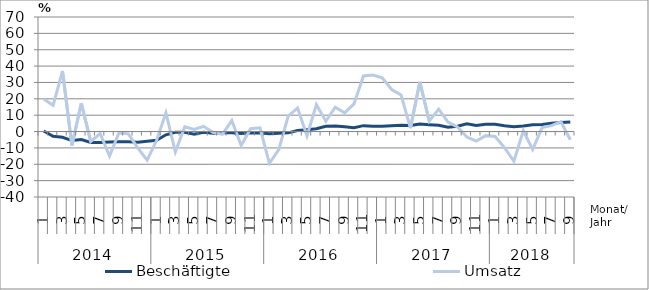
| Category | Beschäftigte | Umsatz |
|---|---|---|
| 0 | 0.3 | 19.9 |
| 1 | -2.9 | 16 |
| 2 | -3.5 | 37 |
| 3 | -5.5 | -8.5 |
| 4 | -4.9 | 17.3 |
| 5 | -6.7 | -6.1 |
| 6 | -6.7 | -1.2 |
| 7 | -6.4 | -15 |
| 8 | -6.2 | -0.8 |
| 9 | -6.2 | -1.4 |
| 10 | -6.6 | -10 |
| 11 | -5.9 | -17.5 |
| 12 | -5.3 | -5.5 |
| 13 | -2 | 11.4 |
| 14 | -0.5 | -12.4 |
| 15 | -0.5 | 2.9 |
| 16 | -1.7 | 1.3 |
| 17 | -0.5 | 3.2 |
| 18 | -1.1 | -0.5 |
| 19 | -0.8 | -1.7 |
| 20 | -0.7 | 6.7 |
| 21 | -1.2 | -8.5 |
| 22 | -0.7 | 1.7 |
| 23 | -0.9 | 2.3 |
| 24 | -1.3 | -19.4 |
| 25 | -1.1 | -11 |
| 26 | -0.8 | 9.4 |
| 27 | 0.6 | 14.4 |
| 28 | 1.1 | -2.6 |
| 29 | 1.7 | 16.5 |
| 30 | 3.2 | 6.3 |
| 31 | 3.4 | 14.9 |
| 32 | 3 | 11.4 |
| 33 | 2.4 | 16.9 |
| 34 | 3.6 | 34 |
| 35 | 3.2 | 34.5 |
| 36 | 3.3 | 32.8 |
| 37 | 3.6 | 25.7 |
| 38 | 3.9 | 22.4 |
| 39 | 3.7 | 2.1 |
| 40 | 4.6 | 30.4 |
| 41 | 4.2 | 6.4 |
| 42 | 3.8 | 13.7 |
| 43 | 2.7 | 5.8 |
| 44 | 3.3 | 2.8 |
| 45 | 4.7 | -3.4 |
| 46 | 3.7 | -5.8 |
| 47 | 4.4 | -2.5 |
| 48 | 4.5 | -3 |
| 49 | 3.6 | -9.8 |
| 50 | 2.9 | -18.1 |
| 51 | 3.4 | 0.5 |
| 52 | 4.2 | -11 |
| 53 | 4.3 | 2.4 |
| 54 | 5.1 | 3.6 |
| 55 | 5.5 | 6.1 |
| 56 | 5.9 | -5 |